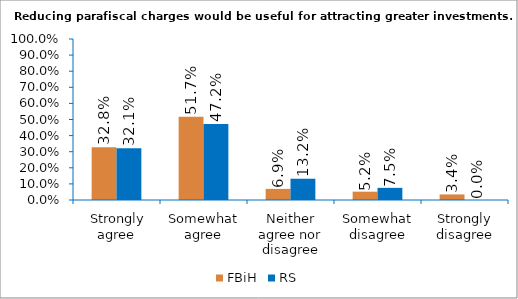
| Category | FBiH | RS |
|---|---|---|
|  Strongly agree | 0.328 | 0.321 |
| Somewhat agree | 0.517 | 0.472 |
| Neither agree nor disagree | 0.069 | 0.132 |
| Somewhat disagree | 0.052 | 0.075 |
| Strongly disagree | 0.034 | 0 |